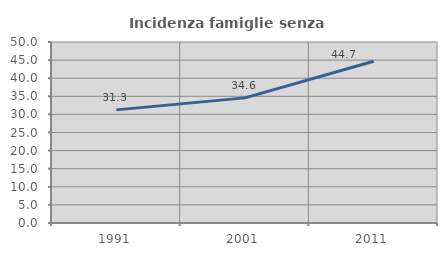
| Category | Incidenza famiglie senza nuclei |
|---|---|
| 1991.0 | 31.25 |
| 2001.0 | 34.564 |
| 2011.0 | 44.688 |